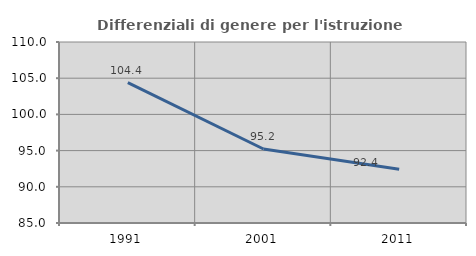
| Category | Differenziali di genere per l'istruzione superiore |
|---|---|
| 1991.0 | 104.393 |
| 2001.0 | 95.22 |
| 2011.0 | 92.423 |